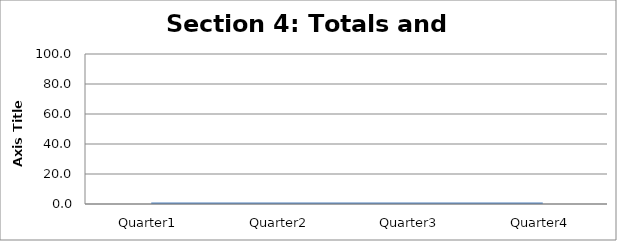
| Category | Section 4: Totals and Compliance |
|---|---|
| Quarter1 | 0 |
| Quarter2 | 0 |
| Quarter3 | 0 |
| Quarter4 | 0 |